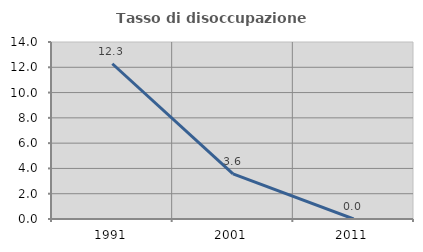
| Category | Tasso di disoccupazione giovanile  |
|---|---|
| 1991.0 | 12.281 |
| 2001.0 | 3.571 |
| 2011.0 | 0 |